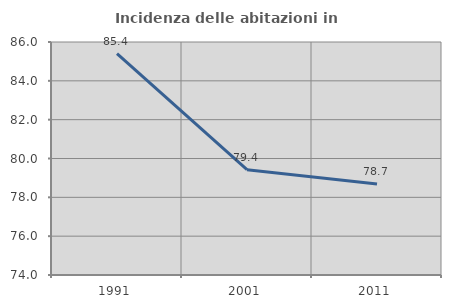
| Category | Incidenza delle abitazioni in proprietà  |
|---|---|
| 1991.0 | 85.406 |
| 2001.0 | 79.426 |
| 2011.0 | 78.683 |